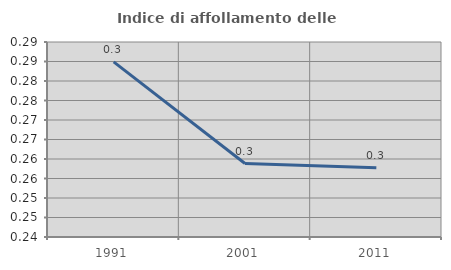
| Category | Indice di affollamento delle abitazioni  |
|---|---|
| 1991.0 | 0.285 |
| 2001.0 | 0.259 |
| 2011.0 | 0.258 |